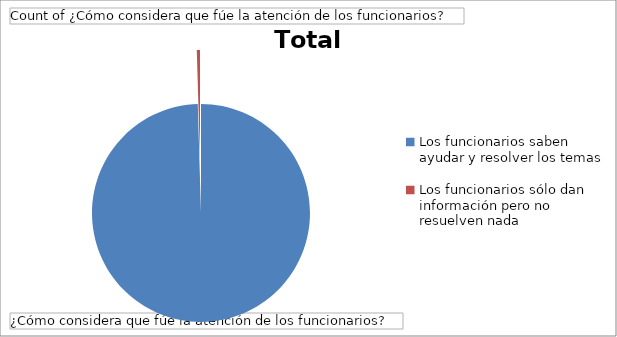
| Category | Total |
|---|---|
| Los funcionarios saben ayudar y resolver los temas | 212 |
| Los funcionarios sólo dan información pero no resuelven nada | 1 |